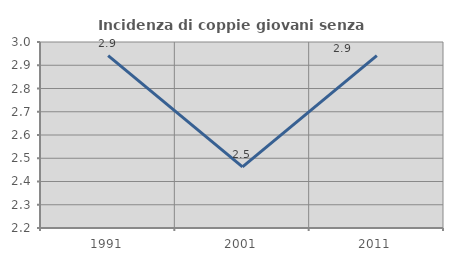
| Category | Incidenza di coppie giovani senza figli |
|---|---|
| 1991.0 | 2.941 |
| 2001.0 | 2.463 |
| 2011.0 | 2.941 |